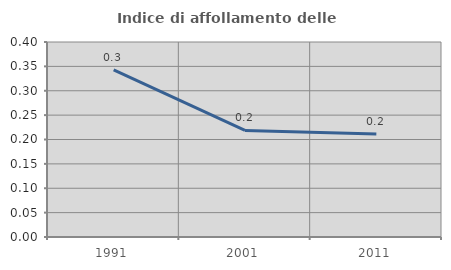
| Category | Indice di affollamento delle abitazioni  |
|---|---|
| 1991.0 | 0.343 |
| 2001.0 | 0.219 |
| 2011.0 | 0.211 |